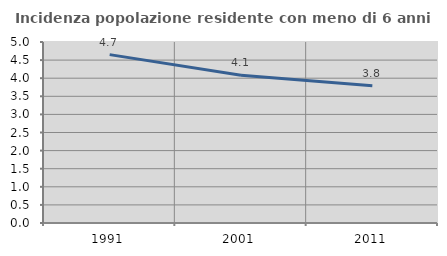
| Category | Incidenza popolazione residente con meno di 6 anni |
|---|---|
| 1991.0 | 4.651 |
| 2001.0 | 4.082 |
| 2011.0 | 3.788 |